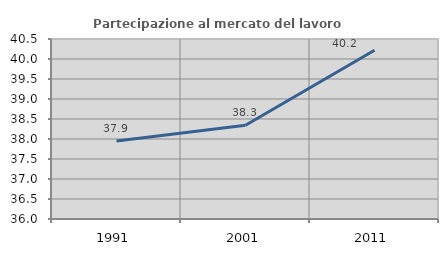
| Category | Partecipazione al mercato del lavoro  femminile |
|---|---|
| 1991.0 | 37.949 |
| 2001.0 | 38.346 |
| 2011.0 | 40.218 |